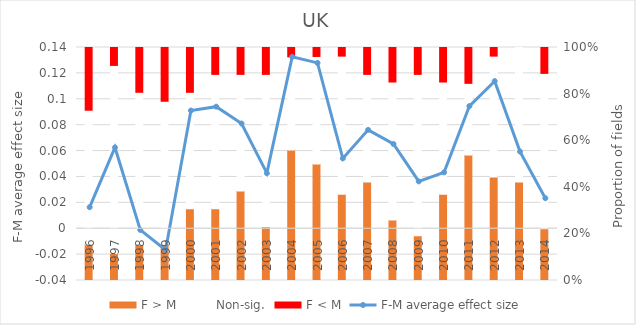
| Category | F > M | Non-sig. | F < M |
|---|---|---|---|
| 0 | 4 | 15 | 7 |
| 1 | 3 | 21 | 2 |
| 2 | 4 | 17 | 5 |
| 3 | 4 | 16 | 6 |
| 4 | 8 | 13 | 5 |
| 5 | 8 | 15 | 3 |
| 6 | 10 | 13 | 3 |
| 7 | 6 | 17 | 3 |
| 8 | 14 | 10 | 1 |
| 9 | 13 | 12 | 1 |
| 10 | 10 | 16 | 1 |
| 11 | 11 | 12 | 3 |
| 12 | 7 | 16 | 4 |
| 13 | 5 | 18 | 3 |
| 14 | 10 | 13 | 4 |
| 15 | 14 | 8 | 4 |
| 16 | 12 | 14 | 1 |
| 17 | 11 | 15 | 0 |
| 18 | 6 | 18 | 3 |